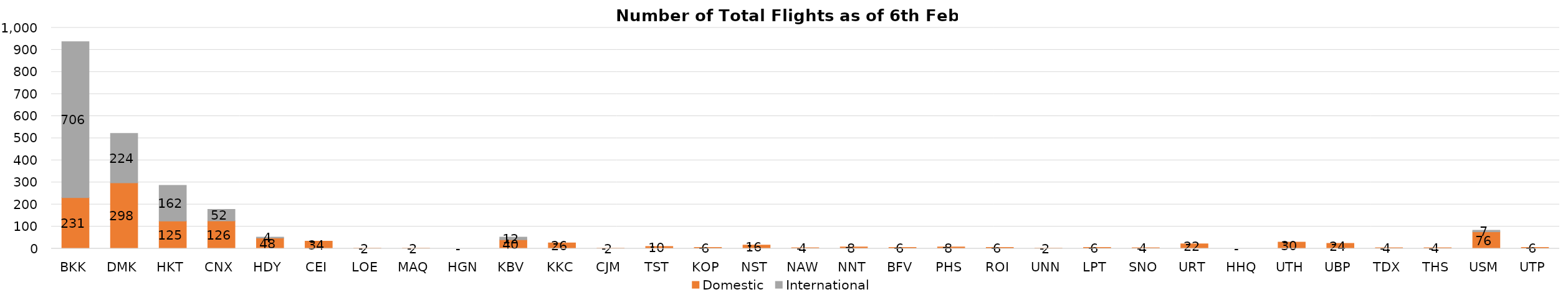
| Category | Domestic | International |
|---|---|---|
| BKK | 231 | 706 |
| DMK | 298 | 224 |
| HKT | 125 | 162 |
| CNX | 126 | 52 |
| HDY | 48 | 4 |
| CEI | 34 | 0 |
| LOE | 2 | 0 |
| MAQ | 2 | 0 |
| HGN | 0 | 0 |
| KBV | 40 | 12 |
| KKC | 26 | 0 |
| CJM | 2 | 0 |
| TST | 10 | 0 |
| KOP | 6 | 0 |
| NST | 16 | 0 |
| NAW | 4 | 0 |
| NNT | 8 | 0 |
| BFV | 6 | 0 |
| PHS | 8 | 0 |
| ROI | 6 | 0 |
| UNN | 2 | 0 |
| LPT | 6 | 0 |
| SNO | 4 | 0 |
| URT | 22 | 0 |
| HHQ | 0 | 0 |
| UTH | 30 | 0 |
| UBP | 24 | 0 |
| TDX | 4 | 0 |
| THS | 4 | 0 |
| USM | 76 | 7 |
| UTP | 6 | 0 |